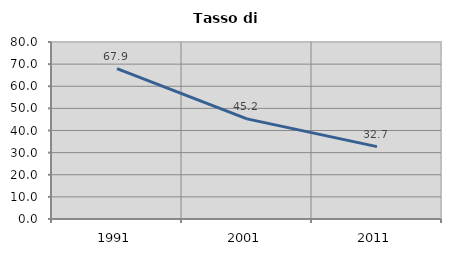
| Category | Tasso di disoccupazione   |
|---|---|
| 1991.0 | 67.942 |
| 2001.0 | 45.249 |
| 2011.0 | 32.711 |